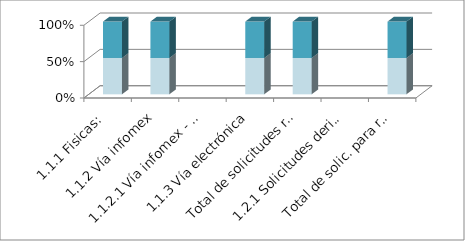
| Category | Series 3 | Series 4 | Series 5 | Series 0 | Series 1 | Series 2 |
|---|---|---|---|---|---|---|
| 1.1.1 Fisicas: |  |  | 4 |  |  | 4 |
| 1.1.2 Vía infomex |  |  | 7 |  |  | 7 |
| 1.1.2.1 Vía infomex - PNT |  |  | 0 |  |  | 0 |
| 1.1.3 Vía electrónica |  |  | 19 |  |  | 19 |
| Total de solicitudes recibidas: |  |  | 30 |  |  | 30 |
| 1.2.1 Solicitudes derivadas por incom |  |  | 0 |  |  | 0 |
| Total de solic. para resolución: |  |  | 30 |  |  | 30 |